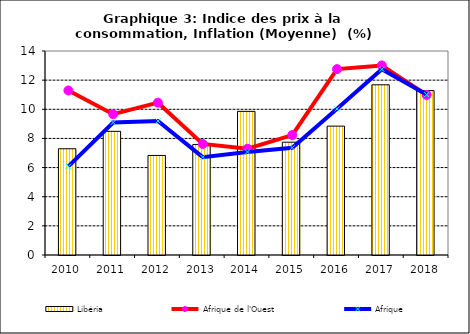
| Category | Libéria |
|---|---|
| 2010.0 | 7.291 |
| 2011.0 | 8.487 |
| 2012.0 | 6.832 |
| 2013.0 | 7.578 |
| 2014.0 | 9.858 |
| 2015.0 | 7.742 |
| 2016.0 | 8.844 |
| 2017.0 | 11.68 |
| 2018.0 | 11.281 |